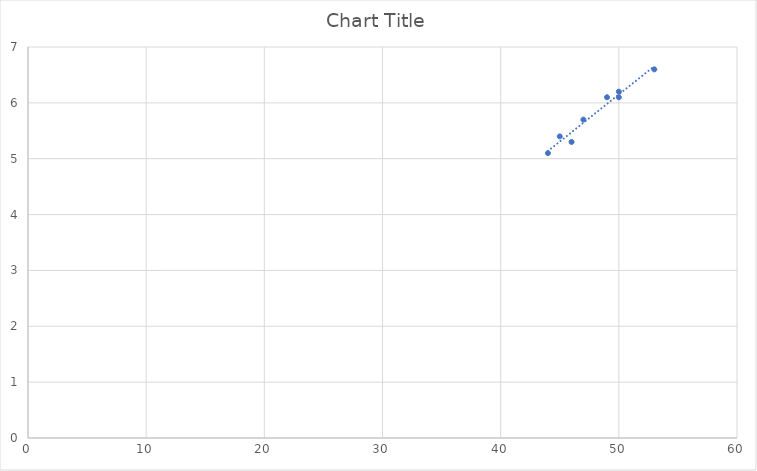
| Category | Series 0 |
|---|---|
| 44.0 | 5.1 |
| 47.0 | 5.7 |
| 45.0 | 5.4 |
| 49.0 | 6.1 |
| 50.0 | 6.2 |
| 53.0 | 6.6 |
| 46.0 | 5.3 |
| 50.0 | 6.1 |